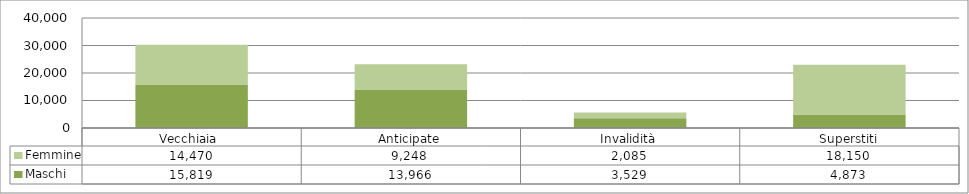
| Category | Maschi | Femmine |
|---|---|---|
| Vecchiaia  | 15819 | 14470 |
| Anticipate | 13966 | 9248 |
| Invalidità | 3529 | 2085 |
| Superstiti | 4873 | 18150 |